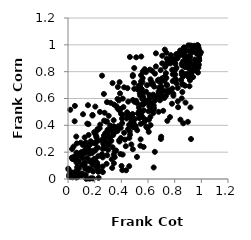
| Category | Series 0 |
|---|---|
| 0.797304120029426 | 0.805 |
| 0.562357184556947 | 0.641 |
| 0.10680305037132208 | 0.037 |
| 0.9210749633324836 | 0.851 |
| 0.9110553314862836 | 0.691 |
| 0.48899094206666055 | 0.39 |
| 0.292231240850581 | 0.573 |
| 0.6947383864375963 | 0.811 |
| 0.542647150077309 | 0.248 |
| 0.5552120279888694 | 0.503 |
| 0.5012308801654148 | 0.446 |
| 0.20232297530727178 | 0.343 |
| 0.7796913870292098 | 0.561 |
| 0.04175667667707427 | 0.241 |
| 0.6522087068755884 | 0.785 |
| 0.18581594822627015 | 0.21 |
| 0.04990359536149041 | 0.43 |
| 0.12496527432047042 | 0.103 |
| 0.8523837978286677 | 0.78 |
| 0.2723379696044072 | 0.246 |
| 0.08138933473945228 | 0.173 |
| 0.915738198230289 | 0.873 |
| 0.18407870867180115 | 0.477 |
| 0.06975780807988681 | 0.191 |
| 0.822844768852436 | 0.679 |
| 0.03783914964844198 | 0.039 |
| 0.2724436079722202 | 0.321 |
| 0.3286869476544123 | 0.383 |
| 0.5074196808023748 | 0.384 |
| 0.3452066169501058 | 0.368 |
| 0.8660786445725674 | 0.969 |
| 0.5507988313020094 | 0.646 |
| 0.2132866893592534 | 0.31 |
| 0.9770257955597358 | 0.829 |
| 0.3736721654983843 | 0.686 |
| 0.15332209954769954 | 0.409 |
| 0.959522285524678 | 0.869 |
| 0.9105750412460314 | 0.84 |
| 0.16311441660137105 | 0.2 |
| 0.6304751476399899 | 0.806 |
| 0.9225078808155771 | 0.298 |
| 0.016827779820845115 | 0.516 |
| 0.872804809920085 | 0.881 |
| 0.03272421377389287 | 0.149 |
| 0.40459552847335645 | 0.449 |
| 0.19645350370171416 | 0.349 |
| 0.93934130254535 | 0.848 |
| 0.631138142138714 | 0.529 |
| 0.44771538818155115 | 0.475 |
| 0.659343890614306 | 0.937 |
| 0.7223621296714514 | 0.604 |
| 0.20224215706489848 | 0.211 |
| 0.12741494213886012 | 0.121 |
| 0.1443889356698664 | 0.23 |
| 0.008023728772806542 | 0.02 |
| 0.22666194082235155 | 0.053 |
| 0.3281425669211869 | 0.147 |
| 0.6809794687354392 | 0.604 |
| 0.9660561663545146 | 0.934 |
| 0.3310503501570942 | 0.36 |
| 0.6848724084109689 | 0.643 |
| 0.8808588103777517 | 0.917 |
| 0.16113645419936 | 0.189 |
| 0.5972478004163653 | 0.378 |
| 0.43587601877007776 | 0.065 |
| 0.6393982162621628 | 0.492 |
| 0.8648941437922311 | 0.765 |
| 0.8032684712133998 | 0.745 |
| 0.9233217938147844 | 0.792 |
| 0.4719972542140556 | 0.407 |
| 0.6365499886286003 | 0.711 |
| 0.30268762180838643 | 0.313 |
| 0.702957025386663 | 0.749 |
| 0.7414386745604448 | 0.704 |
| 0.45045944991184106 | 0.372 |
| 0.15473699106804067 | 0.328 |
| 0.5545125304437247 | 0.668 |
| 0.49676690364538656 | 0.827 |
| 0.02602936098509044 | 0.049 |
| 0.045810744651686996 | 0.166 |
| 0.07406146694787234 | 0.023 |
| 0.918443603866554 | 0.799 |
| 0.10341630874351047 | 0.17 |
| 0.14461916418766874 | 0.154 |
| 0.3427914341111585 | 0.181 |
| 0.22628623821176183 | 0.17 |
| 0.8689484610541626 | 0.963 |
| 0.129187609163948 | 0.193 |
| 0.21180949395285975 | 0.32 |
| 0.8815725052715918 | 0.569 |
| 0.18838875355677628 | 0.004 |
| 0.6190518482586228 | 0.743 |
| 0.74276472355665 | 0.697 |
| 0.9803147501037893 | 0.972 |
| 0.30046426453416303 | 0.217 |
| 0.8394143871771651 | 0.925 |
| 0.519066964696049 | 0.363 |
| 0.5570427996413652 | 0.595 |
| 0.45458405404573626 | 0.464 |
| 0.540816347905991 | 0.623 |
| 0.25542111734223555 | 0.057 |
| 0.532416581095142 | 0.457 |
| 0.1829809473197042 | 0.109 |
| 0.5925604558414671 | 0.699 |
| 0.6224351350225935 | 0.565 |
| 0.3002076240817863 | 0.332 |
| 0.9531077058207814 | 0.808 |
| 0.3714735967905806 | 0.597 |
| 0.2906268035671282 | 0.348 |
| 0.06999816291292076 | 0.14 |
| 0.48494133896559266 | 0.459 |
| 0.4953388224582171 | 0.717 |
| 0.9338875728073217 | 0.979 |
| 0.823182205011867 | 0.579 |
| 0.7858391594595168 | 0.781 |
| 0.3932845069431305 | 0.186 |
| 0.1885405665417277 | 0.056 |
| 0.7354584692676264 | 0.655 |
| 0.060648302424327206 | 0.175 |
| 0.05935084553625411 | 0.058 |
| 0.20801742205660126 | 0.268 |
| 0.9641509602545535 | 0.938 |
| 0.16401753478787567 | 0.138 |
| 0.38127063412288903 | 0.516 |
| 0.8779642598553911 | 0.695 |
| 0.6592409482618403 | 0.839 |
| 0.6510733542427533 | 0.582 |
| 0.9772159047963628 | 0.943 |
| 0.22308847171384444 | 0.365 |
| 0.3352350416149271 | 0.357 |
| 0.33404323952458853 | 0.715 |
| 0.6109073474286287 | 0.626 |
| 0.17469925392602603 | 0.134 |
| 0.9362532482798492 | 0.947 |
| 0.14979038493730507 | 0.55 |
| 0.8704195854369463 | 0.915 |
| 0.3714854138865541 | 0.359 |
| 0.5320488843358153 | 0.532 |
| 0.5285368006332622 | 0.664 |
| 0.5429685772948672 | 0.7 |
| 0.4461229282433632 | 0.677 |
| 0.6057184862246477 | 0.351 |
| 0.49893564743686153 | 0.575 |
| 0.5756301413712744 | 0.819 |
| 0.3194495722353461 | 0.568 |
| 0.42740918105962417 | 0.293 |
| 0.6768639330235154 | 0.631 |
| 0.24380000151550588 | 0.287 |
| 0.12914594599068477 | 0.076 |
| 0.33792508235655505 | 0.327 |
| 0.38596678095672393 | 0.279 |
| 0.253836042151163 | 0.178 |
| 0.13267657503783495 | 0.031 |
| 0.4518898915470631 | 0.577 |
| 0.22114015152068747 | 0.372 |
| 0.7651106759378616 | 0.461 |
| 0.5612880709283763 | 0.802 |
| 0.1611042446127098 | 0.003 |
| 0.6246364032343473 | 0.726 |
| 0.9050246665511441 | 0.843 |
| 0.06249928223592213 | 0.011 |
| 0.937106419909245 | 0.759 |
| 0.383286720690006 | 0.519 |
| 0.7254555668151528 | 0.762 |
| 0.1645117977730222 | 0.208 |
| 0.22456280396033998 | 0.074 |
| 0.4918810724181605 | 0.419 |
| 0.8700690163563919 | 0.98 |
| 0.07869547255718602 | 0.126 |
| 0.9025565244836848 | 0.996 |
| 0.8758902112229859 | 0.955 |
| 0.672815250314741 | 0.607 |
| 0.20485585301376597 | 0.539 |
| 0.03066823520872056 | 0.223 |
| 0.7412310452449627 | 0.896 |
| 0.7340810836164112 | 0.789 |
| 0.22420149753346835 | 0.1 |
| 0.8642706307981797 | 0.415 |
| 0.5727656096740676 | 0.591 |
| 0.4060669496229927 | 0.417 |
| 0.548166236618717 | 0.774 |
| 0.843203091889591 | 0.442 |
| 0.0985648237568677 | 0.026 |
| 0.9148321583627567 | 0.736 |
| 0.8142345100601678 | 0.713 |
| 0.35790775621868903 | 0.353 |
| 0.206093821050002 | 0.129 |
| 0.2703172557518572 | 0.324 |
| 0.7854835093818759 | 0.729 |
| 0.6362372079455503 | 0.613 |
| 0.06598986091912942 | 0.265 |
| 0.293669849148191 | 0.177 |
| 0.41004996959531925 | 0.182 |
| 0.01002077850910882 | 0.034 |
| 0.34955952480190017 | 0.205 |
| 0.46338172848672915 | 0.354 |
| 0.2673401428943209 | 0.302 |
| 0.887785024172174 | 0.783 |
| 0.8953831186326812 | 0.838 |
| 0.9821109829758429 | 0.888 |
| 0.5584376379235363 | 0.723 |
| 0.09608875139694209 | 0.271 |
| 0.7831354166499754 | 0.674 |
| 0.32496604840340954 | 0.285 |
| 0.017226216489252624 | 0.042 |
| 0.10836802645494534 | 0.106 |
| 0.6988554466734901 | 0.315 |
| 0.19770909527727956 | 0.106 |
| 0.85301083655209 | 0.601 |
| 0.5674175522882482 | 0.558 |
| 0.07410152361330873 | 0.02 |
| 0.7227638557844707 | 0.732 |
| 0.48961223081202243 | 0.386 |
| 0.29653284590621415 | 0.25 |
| 0.5675414381891379 | 0.512 |
| 0.8274457523588163 | 0.936 |
| 0.10383125332734139 | 0.026 |
| 0.7338818125610419 | 0.619 |
| 0.2822486413419465 | 0.324 |
| 0.1383652677384979 | 0.235 |
| 0.06845245010346844 | 0.088 |
| 0.46558148122611354 | 0.33 |
| 0.41576375170287677 | 0.536 |
| 0.3784546753050079 | 0.394 |
| 0.8090924068461901 | 0.821 |
| 0.9840513265480847 | 0.885 |
| 0.34517726643714747 | 0.555 |
| 0.603521667022918 | 0.505 |
| 0.781418892971908 | 0.814 |
| 0.27476819642170086 | 0.494 |
| 0.6452212492844311 | 0.526 |
| 0.0022453272982009033 | 0.077 |
| 0.4864344085084499 | 0.222 |
| 0.7658096756290557 | 0.661 |
| 0.5235235113742388 | 0.489 |
| 0.4749817695632405 | 0.257 |
| 0.11010126634993554 | 0.154 |
| 0.06415876302788492 | 0.122 |
| 0.9050520588248738 | 0.957 |
| 0.9324910053666117 | 0.803 |
| 0.2133686257052494 | 0.227 |
| 0.6737084610712148 | 0.733 |
| 0.2615726482339896 | 0.052 |
| 0.5671239560994262 | 0.239 |
| 0.1810660277488201 | 0.194 |
| 0.11215845829499524 | 0.111 |
| 0.4014986894451708 | 0.097 |
| 0.2412715714463095 | 0.405 |
| 0.03439510009841737 | 0.013 |
| 0.1755055344822647 | 0.006 |
| 0.8575446890679195 | 0.648 |
| 0.23985168855966224 | 0.5 |
| 0.6426607134174304 | 0.086 |
| 0.45988779002494656 | 0.307 |
| 0.8799264748782678 | 0.95 |
| 0.26916667587104687 | 0.634 |
| 0.4591966894752576 | 0.096 |
| 0.857182499162693 | 0.846 |
| 0.7734085598031991 | 0.88 |
| 0.5652728024066601 | 0.61 |
| 0.8694342227649041 | 0.977 |
| 0.9825818915672876 | 0.902 |
| 0.6513725492405789 | 0.202 |
| 0.295738558599487 | 0.336 |
| 0.26020869760470455 | 0.093 |
| 0.5796788552624791 | 0.436 |
| 0.4582153987161802 | 0.404 |
| 0.38142065952664705 | 0.586 |
| 0.5200496166068674 | 0.564 |
| 0.8477210650049647 | 0.738 |
| 0.5882600367158707 | 0.57 |
| 0.6971103597099408 | 0.298 |
| 0.407214119637355 | 0.066 |
| 0.8039897851006478 | 0.777 |
| 0.9807452674552787 | 0.854 |
| 0.38379778552751426 | 0.289 |
| 0.5614805224067287 | 0.554 |
| 0.8836726423037224 | 0.871 |
| 0.9447524073055915 | 0.817 |
| 0.8644978518637901 | 0.96 |
| 0.07576121161950675 | 0.134 |
| 0.2603331779744485 | 0.161 |
| 0.7538686459995365 | 0.646 |
| 0.8094906222755434 | 0.892 |
| 0.43330961252376127 | 0.245 |
| 0.4431646850943232 | 0.497 |
| 0.39472319933808764 | 0.521 |
| 0.618096083391179 | 0.463 |
| 0.2602046042790533 | 0.224 |
| 0.2895184351533712 | 0.113 |
| 0.07310537785946165 | 0.045 |
| 0.05828456534873092 | 0.142 |
| 0.9068467683924778 | 0.823 |
| 0.3956129694781057 | 0.381 |
| 0.0516951853102892 | 0.545 |
| 0.5756874430026223 | 0.446 |
| 0.6180661632846933 | 0.615 |
| 0.004809480179992467 | 0.07 |
| 0.9825613853273992 | 0.954 |
| 0.15684512268392706 | 0.078 |
| 0.5446679513971208 | 0.296 |
| 0.790492964055465 | 0.621 |
| 0.3054453251772024 | 0.471 |
| 0.5554888625045465 | 0.467 |
| 0.02686627554059232 | 0.046 |
| 0.7066479047382231 | 0.919 |
| 0.9151003660005707 | 0.911 |
| 0.9457435785732388 | 0.993 |
| 0.90095803491139 | 0.905 |
| 0.9067710662359609 | 0.89 |
| 0.528862186058034 | 0.693 |
| 0.3626815460336315 | 0.543 |
| 0.5866720743469122 | 0.39 |
| 0.39657103228836854 | 0.305 |
| 0.014730724771870797 | 0.029 |
| 0.029920722607236227 | 0.035 |
| 0.48696318953746487 | 0.589 |
| 0.7284497106145716 | 0.836 |
| 0.9199815790702903 | 0.995 |
| 0.30613459372560664 | 0.259 |
| 0.0669780876922208 | 0.06 |
| 0.7263412560391058 | 0.746 |
| 0.6076121965987406 | 0.593 |
| 0.06201714419842743 | 0.316 |
| 0.10064061084578058 | 0.201 |
| 0.7050010169363431 | 0.624 |
| 0.0766252179057523 | 0.087 |
| 0.8592773684940184 | 0.927 |
| 0.6247312873540295 | 0.709 |
| 0.6822901701502448 | 0.68 |
| 0.8257055690172047 | 0.535 |
| 0.9633764689223475 | 0.983 |
| 0.13705828105226775 | 0.001 |
| 0.14477100718266808 | 0.413 |
| 0.28579359313208597 | 0.428 |
| 0.3130297786562835 | 0.302 |
| 0.6899467826698211 | 0.587 |
| 0.9539044764418823 | 0.985 |
| 0.9297175533848173 | 0.95 |
| 0.397381141640462 | 0.486 |
| 0.619306198417967 | 0.401 |
| 0.2651237000391106 | 0.261 |
| 0.06331651306339428 | 0.196 |
| 0.7964426893282355 | 0.896 |
| 0.22978981004316248 | 0.009 |
| 0.743442544627824 | 0.867 |
| 0.8760143716886184 | 0.972 |
| 0.46234573667447093 | 0.469 |
| 0.8562790481345838 | 0.705 |
| 0.19042172374567648 | 0.126 |
| 0.12475027504628891 | 0.31 |
| 0.35951321038766704 | 0.375 |
| 0.42068747166704823 | 0.345 |
| 0.27546209463214005 | 0.275 |
| 0.5494695950315683 | 0.913 |
| 0.48581099935149097 | 0.767 |
| 0.21625445125874593 | 0.283 |
| 0.7139729454529784 | 0.508 |
| 0.3432241163834253 | 0.393 |
| 0.19382821100100156 | 0.268 |
| 0.4552235073574578 | 0.481 |
| 0.9784545831754908 | 0.847 |
| 0.6464367453308284 | 0.61 |
| 0.032435237734660075 | 0.157 |
| 0.677905402750759 | 0.74 |
| 0.8567298283045552 | 0.854 |
| 0.16998374227502902 | 0.281 |
| 0.6102185368032516 | 0.541 |
| 0.3504658569854561 | 0.163 |
| 0.49676613900140887 | 0.672 |
| 0.6798972998590397 | 0.501 |
| 0.9968988769972482 | 0.945 |
| 0.3870013244021764 | 0.722 |
| 0.29712299850714974 | 0.368 |
| 0.7260661426685774 | 0.964 |
| 0.15042039426362816 | 0.242 |
| 0.5384596136964156 | 0.455 |
| 0.9747916835115862 | 0.793 |
| 0.7689942963353654 | 0.861 |
| 0.3347029078208359 | 0.236 |
| 0.917203889078772 | 0.771 |
| 0.467721457080699 | 0.452 |
| 0.27035746845487907 | 0.435 |
| 0.7424563624404802 | 0.856 |
| 0.2553658385855573 | 0.184 |
| 0.5695583119963499 | 0.422 |
| 0.771076913698367 | 0.924 |
| 0.21910179362404075 | 0.12 |
| 0.9057513528263446 | 0.757 |
| 0.9767790280379692 | 0.991 |
| 0.7743268950842448 | 0.876 |
| 0.22387142021862252 | 0.233 |
| 0.23767545307786073 | 0.378 |
| 0.9348922897027911 | 0.762 |
| 0.6460622941644426 | 0.689 |
| 0.5842662489798098 | 0.796 |
| 0.6919693569353385 | 0.719 |
| 0.10116966542848344 | 0.041 |
| 0.21262757020652331 | 0.091 |
| 0.48633450989087246 | 0.775 |
| 0.7190362819838224 | 0.755 |
| 0.9421776042672716 | 0.967 |
| 0.31595131355604333 | 0.399 |
| 0.9775082314541079 | 0.974 |
| 0.48414181989500454 | 0.484 |
| 0.5479995844867132 | 0.727 |
| 0.5115442619289495 | 0.907 |
| 0.7024560405918445 | 0.687 |
| 0.5097805970019827 | 0.583 |
| 0.7450069630964918 | 0.434 |
| 0.16248669432945304 | 0.132 |
| 0.7503567605256987 | 0.657 |
| 0.2830791694619875 | 0.264 |
| 0.28519696175470305 | 0.277 |
| 0.5385193362197296 | 0.639 |
| 0.8113984964656171 | 0.93 |
| 0.41071914085660216 | 0.599 |
| 0.6141924025199114 | 0.815 |
| 0.9116224893443969 | 0.921 |
| 0.8991625504133357 | 0.426 |
| 0.8057019267391398 | 0.858 |
| 0.015661915755941974 | 0.016 |
| 0.6385026655596802 | 0.513 |
| 0.5272431736075213 | 0.666 |
| 0.34421798561215405 | 0.118 |
| 0.18362760949765966 | 0.473 |
| 0.15313383570546582 | 0.064 |
| 0.5598913405731432 | 0.752 |
| 0.8609393445567936 | 0.707 |
| 0.8137282137763063 | 0.83 |
| 0.6070206935943088 | 0.441 |
| 0.20607146033773108 | 0.334 |
| 0.8414749345524128 | 0.958 |
| 0.29025393959805806 | 0.339 |
| 0.7380280325528474 | 0.941 |
| 0.37149336084959533 | 0.526 |
| 0.7974506682067312 | 0.787 |
| 0.29241995835013396 | 0.429 |
| 0.34265281128710257 | 0.438 |
| 0.39011024347265294 | 0.523 |
| 0.8777436865434023 | 0.834 |
| 0.7898541810798125 | 0.636 |
| 0.7722232461864666 | 0.902 |
| 0.5425761005861899 | 0.495 |
| 0.04627374476935412 | 0.146 |
| 0.7063876377240527 | 0.862 |
| 0.8541766694042916 | 0.797 |
| 0.2552027712553556 | 0.77 |
| 0.27959808542192954 | 0.341 |
| 0.08259889034940095 | 0.08 |
| 0.19608152867063164 | 0.15 |
| 0.5345278511078847 | 0.506 |
| 0.0718846000526459 | 0.015 |
| 0.5470415237319559 | 0.673 |
| 0.9411754766869815 | 0.989 |
| 0.36135053411920337 | 0.212 |
| 0.8222868577643778 | 0.899 |
| 0.5066670601417708 | 0.396 |
| 0.4744401138850245 | 0.424 |
| 0.7376615250901122 | 0.753 |
| 0.9182837378891604 | 0.533 |
| 0.12162286062001304 | 0.101 |
| 0.13298646174309464 | 0.273 |
| 0.267556850640766 | 0.29 |
| 0.11275891338012904 | 0.483 |
| 0.3311985178689576 | 0.082 |
| 0.9711901253785186 | 0.999 |
| 0.6388332280423312 | 0.629 |
| 0.6794441233843596 | 0.652 |
| 0.16301379789801654 | 0.254 |
| 0.15449477338634737 | 0.218 |
| 0.46409077112375724 | 0.909 |
| 0.5462041460638986 | 0.411 |
| 0.9889556700665192 | 0.928 |
| 0.6919381977309248 | 0.663 |
| 0.7139344430014956 | 0.658 |
| 0.11043020945263346 | 0.254 |
| 0.6321346026048353 | 0.549 |
| 0.40993756799125786 | 0.479 |
| 0.8086763517272694 | 0.741 |
| 0.1745721798283946 | 0.071 |
| 0.2029678548489935 | 0.143 |
| 0.5173963668490128 | 0.164 |
| 0.11870409010896339 | 0.116 |
| 0.696318610579544 | 0.618 |
| 0.6432320884267461 | 0.547 |
| 0.783442085726307 | 0.883 |
| 0.5861662409248689 | 0.65 |
| 0.39018518610185277 | 0.638 |
| 0.5562254789042881 | 0.557 |
| 0.8565719197163875 | 0.864 |
| 0.43923968506000294 | 0.451 |
| 0.8634291659700921 | 0.877 |
| 0.1269591536728831 | 0.215 |
| 0.2707932325231331 | 0.229 |
| 0.9553391238210023 | 0.987 |
| 0.4205014791503321 | 0.683 |
| 0.9494315298170858 | 0.89 |
| 0.9606594686665789 | 0.826 |
| 0.029016260346457073 | 0.16 |